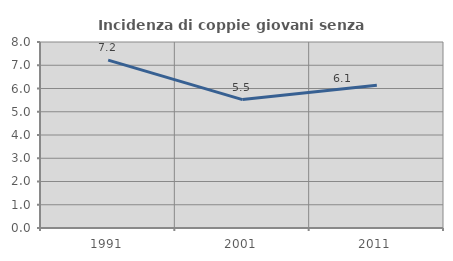
| Category | Incidenza di coppie giovani senza figli |
|---|---|
| 1991.0 | 7.222 |
| 2001.0 | 5.523 |
| 2011.0 | 6.144 |